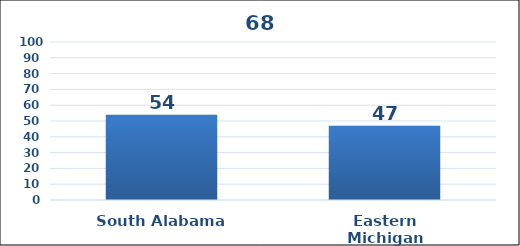
| Category | Series 0 |
|---|---|
| South Alabama | 54 |
| Eastern Michigan | 47 |